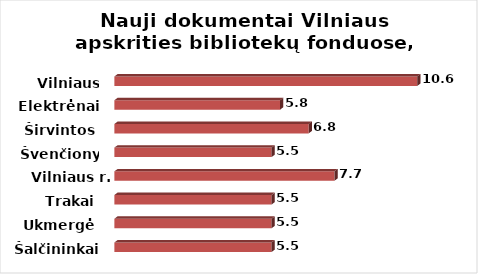
| Category | Series 0 |
|---|---|
| Šalčininkai | 5.5 |
| Ukmergė | 5.5 |
| Trakai | 5.5 |
| Vilniaus r. | 7.7 |
| Švenčionys | 5.5 |
| Širvintos | 6.8 |
| Elektrėnai | 5.8 |
| Vilniaus m. | 10.6 |